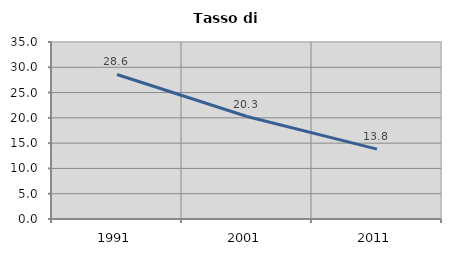
| Category | Tasso di disoccupazione   |
|---|---|
| 1991.0 | 28.577 |
| 2001.0 | 20.262 |
| 2011.0 | 13.82 |